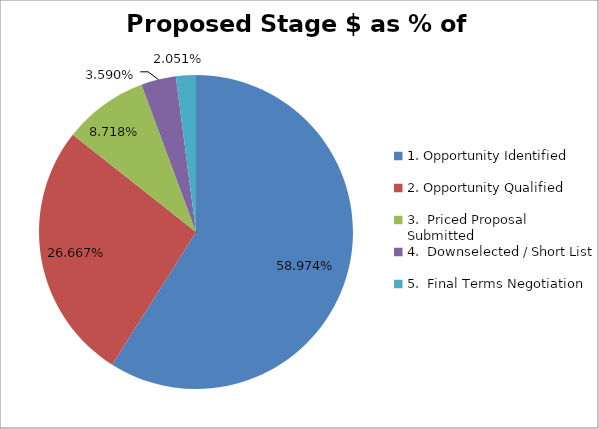
| Category | Proposed Stage $ as % of Pipeline |
|---|---|
| 1. Opportunity Identified | 0.59 |
| 2. Opportunity Qualified | 0.267 |
| 3.  Priced Proposal Submitted | 0.087 |
| 4.  Downselected / Short List | 0.036 |
| 5.  Final Terms Negotiation | 0.021 |